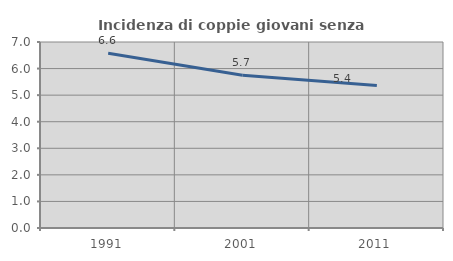
| Category | Incidenza di coppie giovani senza figli |
|---|---|
| 1991.0 | 6.573 |
| 2001.0 | 5.748 |
| 2011.0 | 5.365 |